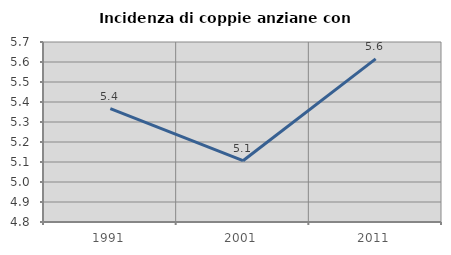
| Category | Incidenza di coppie anziane con figli |
|---|---|
| 1991.0 | 5.367 |
| 2001.0 | 5.106 |
| 2011.0 | 5.616 |